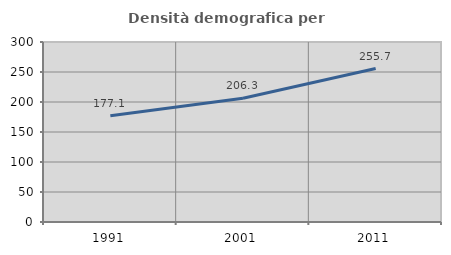
| Category | Densità demografica |
|---|---|
| 1991.0 | 177.065 |
| 2001.0 | 206.336 |
| 2011.0 | 255.696 |